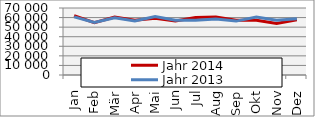
| Category | Jahr 2014 | Jahr 2013 |
|---|---|---|
| Jan | 61946.334 | 60681.788 |
| Feb | 54559.743 | 55014.499 |
| Mär | 60474.221 | 59811.893 |
| Apr | 57178.621 | 56337.799 |
| Mai | 59369.043 | 61133.704 |
| Jun | 56350.831 | 57121.25 |
| Jul | 60044.636 | 57174.487 |
| Aug | 60631.707 | 58383.997 |
| Sep | 57104.686 | 56305.416 |
| Okt | 57092.37 | 60561.16 |
| Nov | 53873.065 | 57307.958 |
| Dez | 57777.836 | 58806.941 |